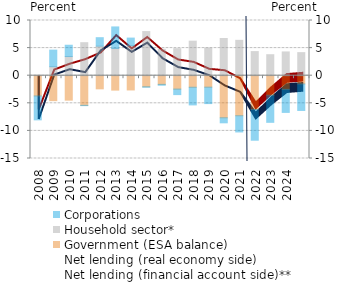
| Category | Government (ESA balance) | Household sector* | Corporations |
|---|---|---|---|
| 2008.0 | -3.672 | 0.06 | -4.324 |
| 2009.0 | -4.521 | 1.631 | 3.004 |
| 2010.0 | -4.43 | 3.469 | 2.049 |
| 2011.0 | -5.368 | 5.98 | -0.054 |
| 2012.0 | -2.381 | 5.354 | 1.531 |
| 2013.0 | -2.611 | 4.941 | 3.894 |
| 2014.0 | -2.581 | 5.446 | 1.367 |
| 2015.0 | -2.003 | 7.997 | -0.093 |
| 2016.0 | -1.573 | 4.78 | -0.154 |
| 2017.0 | -2.428 | 4.896 | -0.998 |
| 2018.0 | -2.094 | 6.26 | -3.197 |
| 2019.0 | -2.078 | 5.012 | -2.975 |
| 2020.0 | -7.623 | 6.742 | -0.911 |
| 2021.0 | -7.254 | 6.411 | -2.937 |
| 2022.0 | -6.126 | 4.369 | -5.562 |
| 2023.0 | -3.539 | 3.801 | -4.909 |
| 2024.0 | -2.476 | 4.304 | -4.173 |
| 2025.0 | -1.496 | 4.178 | -4.802 |